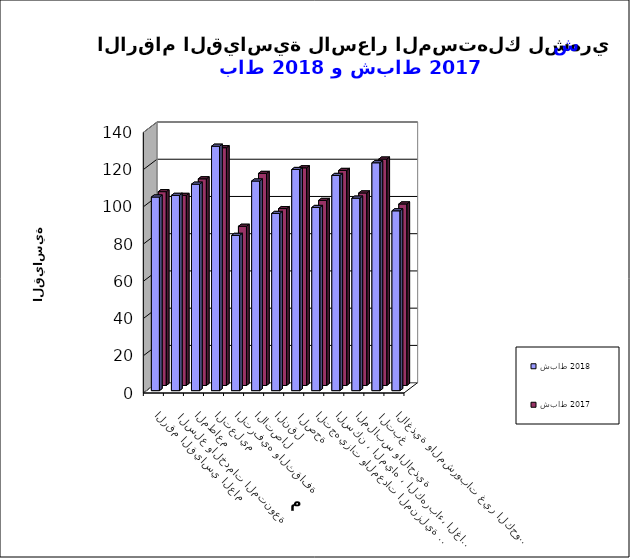
| Category | شباط 2018      | شباط 2017 |
|---|---|---|
| الاغذية والمشروبات غير الكحولية | 96.6 | 97.5 |
|  التبغ | 122.4 | 121.6 |
| الملابس والاحذية | 103.4 | 103.4 |
| السكن ، المياه ، الكهرباء، الغاز  | 115.6 | 115.5 |
| التجهيزات والمعدات المنزلية والصيانة | 98.4 | 99.4 |
|  الصحة | 118.8 | 116.9 |
| النقل | 95.2 | 95 |
| الاتصال | 112.6 | 113.9 |
| الترفيه والثقافة | 83.4 | 85.5 |
| التعليم | 131.3 | 127.7 |
| المطاعم  | 110.9 | 111 |
|  السلع والخدمات المتنوعة | 104.9 | 102.1 |
| الرقم القياسي العام | 104 | 104.1 |